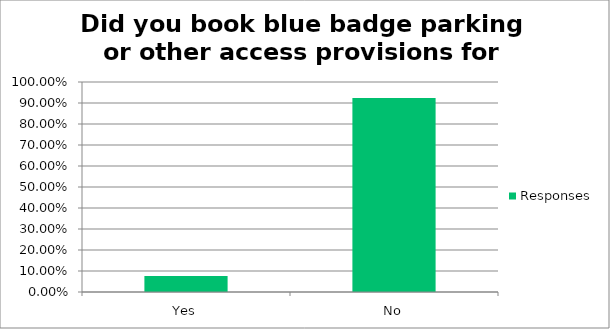
| Category | Responses |
|---|---|
| Yes | 0.076 |
| No | 0.924 |